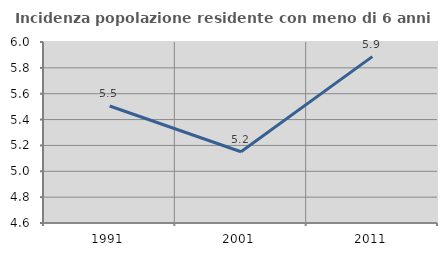
| Category | Incidenza popolazione residente con meno di 6 anni |
|---|---|
| 1991.0 | 5.505 |
| 2001.0 | 5.151 |
| 2011.0 | 5.887 |